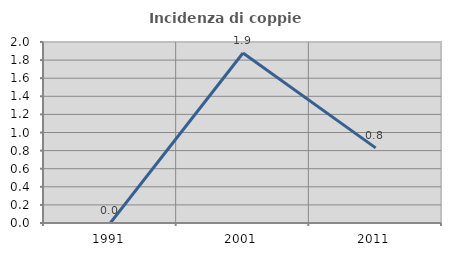
| Category | Incidenza di coppie miste |
|---|---|
| 1991.0 | 0 |
| 2001.0 | 1.878 |
| 2011.0 | 0.83 |